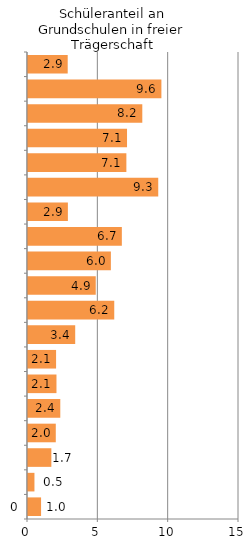
| Category | Series 0 |
|---|---|
| 0 | 1.001 |
| 1 | 0.53 |
| 2 | 1.732 |
| 3 | 2.046 |
| 4 | 2.367 |
| 5 | 2.096 |
| 6 | 2.068 |
| 7 | 3.427 |
| 8 | 6.203 |
| 9 | 4.887 |
| 10 | 5.963 |
| 11 | 6.743 |
| 12 | 2.906 |
| 13 | 9.331 |
| 14 | 7.064 |
| 15 | 7.111 |
| 16 | 8.197 |
| 17 | 9.554 |
| 18 | 2.894 |